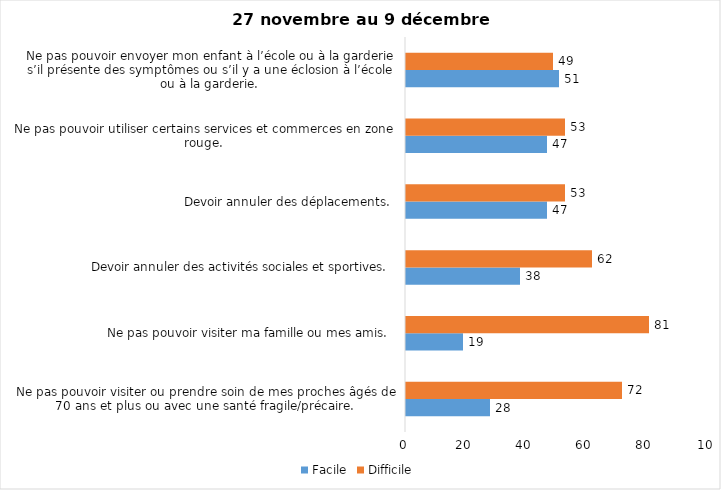
| Category | Facile | Difficile |
|---|---|---|
| Ne pas pouvoir visiter ou prendre soin de mes proches âgés de 70 ans et plus ou avec une santé fragile/précaire.  | 28 | 72 |
| Ne pas pouvoir visiter ma famille ou mes amis.  | 19 | 81 |
| Devoir annuler des activités sociales et sportives.  | 38 | 62 |
| Devoir annuler des déplacements.  | 47 | 53 |
| Ne pas pouvoir utiliser certains services et commerces en zone rouge.  | 47 | 53 |
| Ne pas pouvoir envoyer mon enfant à l’école ou à la garderie s’il présente des symptômes ou s’il y a une éclosion à l’école ou à la garderie.  | 51 | 49 |